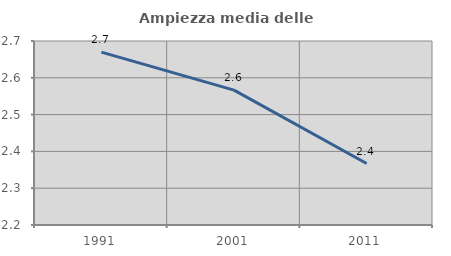
| Category | Ampiezza media delle famiglie |
|---|---|
| 1991.0 | 2.67 |
| 2001.0 | 2.566 |
| 2011.0 | 2.367 |